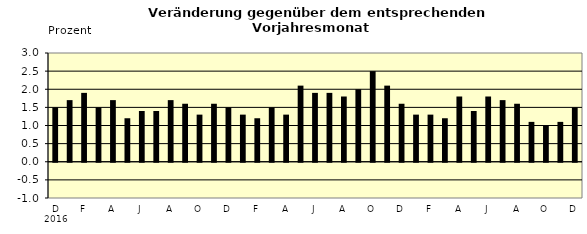
| Category | Series 0 |
|---|---|
| 0 | 1.5 |
| 1 | 1.7 |
| 2 | 1.9 |
| 3 | 1.5 |
| 4 | 1.7 |
| 5 | 1.2 |
| 6 | 1.4 |
| 7 | 1.4 |
| 8 | 1.7 |
| 9 | 1.6 |
| 10 | 1.3 |
| 11 | 1.6 |
| 12 | 1.5 |
| 13 | 1.3 |
| 14 | 1.2 |
| 15 | 1.5 |
| 16 | 1.3 |
| 17 | 2.1 |
| 18 | 1.9 |
| 19 | 1.9 |
| 20 | 1.8 |
| 21 | 2 |
| 22 | 2.5 |
| 23 | 2.1 |
| 24 | 1.6 |
| 25 | 1.3 |
| 26 | 1.3 |
| 27 | 1.2 |
| 28 | 1.8 |
| 29 | 1.4 |
| 30 | 1.8 |
| 31 | 1.7 |
| 32 | 1.6 |
| 33 | 1.1 |
| 34 | 1 |
| 35 | 1.1 |
| 36 | 1.5 |